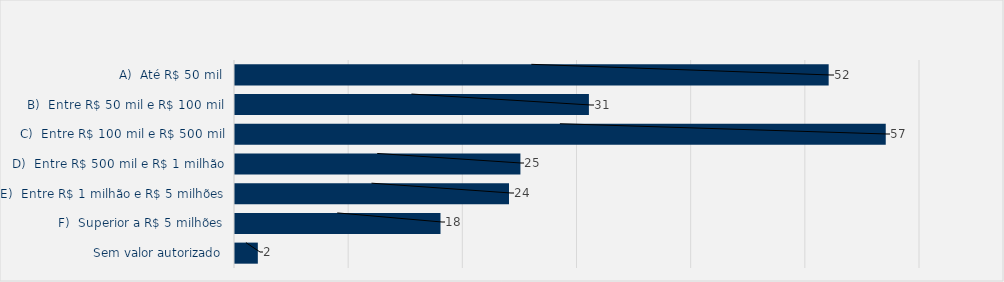
| Category | Total |
|---|---|
| A)  Até R$ 50 mil | 52 |
| B)  Entre R$ 50 mil e R$ 100 mil | 31 |
| C)  Entre R$ 100 mil e R$ 500 mil | 57 |
| D)  Entre R$ 500 mil e R$ 1 milhão | 25 |
| E)  Entre R$ 1 milhão e R$ 5 milhões | 24 |
| F)  Superior a R$ 5 milhões | 18 |
| Sem valor autorizado | 2 |